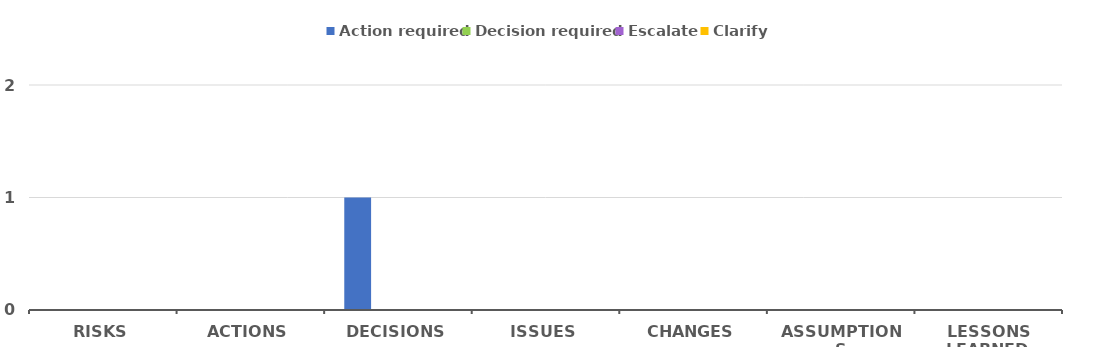
| Category | Action required | Decision required | Escalate | Clarify |
|---|---|---|---|---|
| RISKS | 0 | 0 | 0 | 0 |
| ACTIONS | 0 | 0 | 0 | 0 |
| DECISIONS | 1 | 0 | 0 | 0 |
| ISSUES | 0 | 0 | 0 | 0 |
| CHANGES | 0 | 0 | 0 | 0 |
| ASSUMPTIONS | 0 | 0 | 0 | 0 |
| LESSONS LEARNED | 0 | 0 | 0 | 0 |